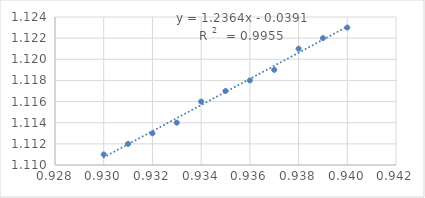
| Category | Series 0 |
|---|---|
| 0.93 | 1.111 |
| 0.931 | 1.112 |
| 0.932 | 1.113 |
| 0.933 | 1.114 |
| 0.934 | 1.116 |
| 0.935 | 1.117 |
| 0.936 | 1.118 |
| 0.937 | 1.119 |
| 0.938 | 1.121 |
| 0.939 | 1.122 |
| 0.94 | 1.123 |